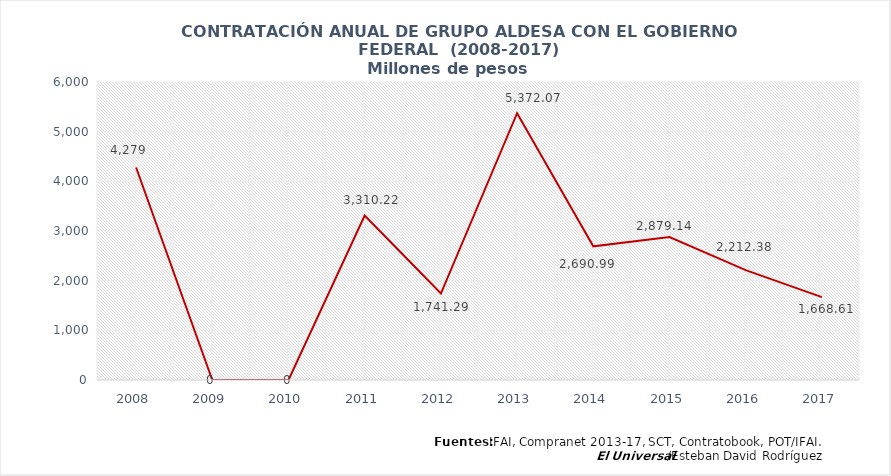
| Category | VALOR DE LOS CONTRATOS SUSCRITOS               (Millones de pesos) |
|---|---|
| 2008.0 | 4279.23 |
| 2009.0 | 0 |
| 2010.0 | 0 |
| 2011.0 | 3310.22 |
| 2012.0 | 1741.29 |
| 2013.0 | 5372.07 |
| 2014.0 | 2690.99 |
| 2015.0 | 2879.14 |
| 2016.0 | 2212.38 |
| 2017.0 | 1668.61 |